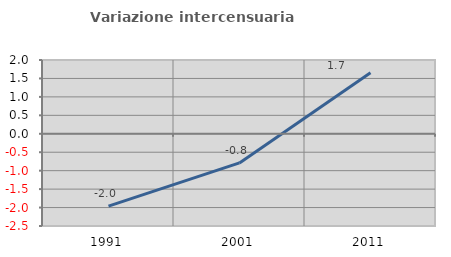
| Category | Variazione intercensuaria annua |
|---|---|
| 1991.0 | -1.963 |
| 2001.0 | -0.79 |
| 2011.0 | 1.656 |